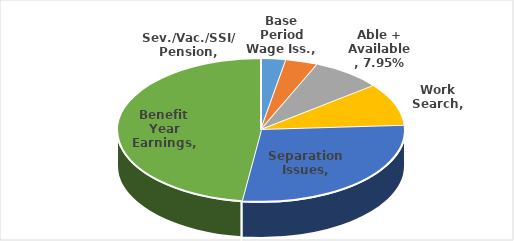
| Category | Series 0 |
|---|---|
| Base Period Wage Iss. | 0.028 |
| Sev./Vac./SSI/ Pension | 0.036 |
| Able + Available | 0.08 |
| Work Search | 0.097 |
| Separation Issues | 0.281 |
| Benefit Year Earnings | 0.479 |